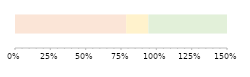
| Category | Series 0 | Series 1 | Series 2 |
|---|---|---|---|
| 0 | 0.787 | 0.157 | 0.556 |